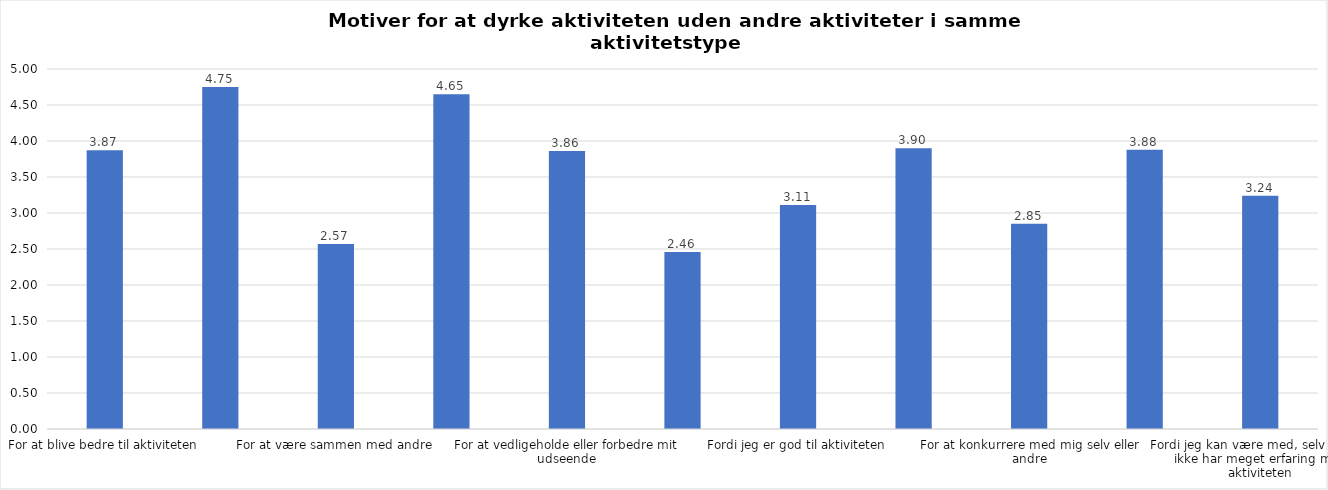
| Category | Gennemsnit |
|---|---|
| For at blive bedre til aktiviteten | 3.87 |
| For at vedligeholde eller forbedre min sundhed (fx helbred, fysisk form) | 4.75 |
| For at være sammen med andre | 2.57 |
| For at gøre noget godt for mig selv | 4.65 |
| For at vedligeholde eller forbedre mit udseende | 3.86 |
| Fordi andre i min omgangskreds opmuntrer mig til det | 2.46 |
| Fordi jeg er god til aktiviteten | 3.11 |
| Fordi jeg godt kan lide aktiviteten | 3.9 |
| For at konkurrere med mig selv eller andre | 2.85 |
| Fordi aktiviteten passer godt ind i min hverdag | 3.88 |
| Fordi jeg kan være med, selv om jeg ikke har meget erfaring med aktiviteten | 3.24 |